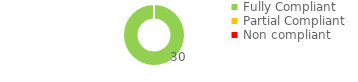
| Category | Series 0 |
|---|---|
| Fully Compliant | 30 |
| Partial Compliant | 0 |
| Non compliant | 0 |